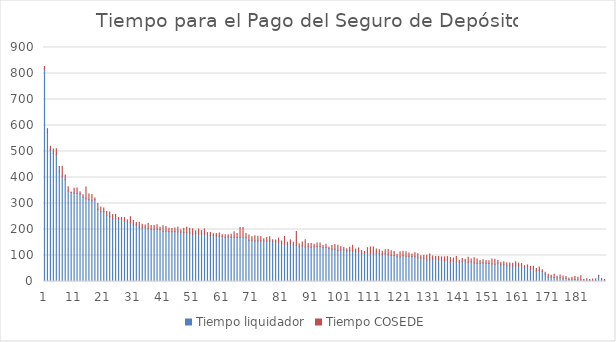
| Category | Tiempo liquidador | Tiempo COSEDE |
|---|---|---|
| 0 | 817 | 10 |
| 1 | 573 | 15 |
| 2 | 507 | 13 |
| 3 | 492 | 18 |
| 4 | 488 | 23 |
| 5 | 422 | 20 |
| 6 | 405 | 38 |
| 7 | 391 | 19 |
| 8 | 348 | 16 |
| 9 | 342 | 2 |
| 10 | 339 | 20 |
| 11 | 338 | 22 |
| 12 | 336 | 9 |
| 13 | 324 | 10 |
| 14 | 318 | 45 |
| 15 | 314 | 23 |
| 16 | 311 | 24 |
| 17 | 314 | 7 |
| 18 | 278 | 22 |
| 19 | 268 | 19 |
| 20 | 269 | 14 |
| 21 | 256 | 13 |
| 22 | 250 | 17 |
| 23 | 240 | 18 |
| 24 | 242 | 17 |
| 25 | 240 | 6 |
| 26 | 239 | 7 |
| 27 | 232 | 14 |
| 28 | 229 | 8 |
| 29 | 226 | 23 |
| 30 | 215 | 20 |
| 31 | 217 | 10 |
| 32 | 209 | 19 |
| 33 | 206 | 14 |
| 34 | 210 | 7 |
| 35 | 203 | 20 |
| 36 | 201 | 14 |
| 37 | 201 | 14 |
| 38 | 201 | 17 |
| 39 | 200 | 9 |
| 40 | 192 | 22 |
| 41 | 193 | 19 |
| 42 | 191 | 14 |
| 43 | 191 | 13 |
| 44 | 191 | 15 |
| 45 | 190 | 19 |
| 46 | 189 | 10 |
| 47 | 188 | 17 |
| 48 | 188 | 21 |
| 49 | 186 | 19 |
| 50 | 181 | 22 |
| 51 | 185 | 10 |
| 52 | 181 | 21 |
| 53 | 184 | 12 |
| 54 | 182 | 20 |
| 55 | 179 | 9 |
| 56 | 176 | 13 |
| 57 | 177 | 7 |
| 58 | 175 | 10 |
| 59 | 174 | 13 |
| 60 | 173 | 7 |
| 61 | 170 | 10 |
| 62 | 171 | 9 |
| 63 | 170 | 12 |
| 64 | 170 | 21 |
| 65 | 169 | 16 |
| 66 | 170 | 38 |
| 67 | 170 | 38 |
| 68 | 168 | 17 |
| 69 | 159 | 20 |
| 70 | 159 | 13 |
| 71 | 156 | 20 |
| 72 | 156 | 18 |
| 73 | 157 | 16 |
| 74 | 156 | 8 |
| 75 | 156 | 13 |
| 76 | 155 | 17 |
| 77 | 153 | 8 |
| 78 | 152 | 8 |
| 79 | 150 | 17 |
| 80 | 146 | 10 |
| 81 | 143 | 30 |
| 82 | 141 | 10 |
| 83 | 145 | 15 |
| 84 | 140 | 11 |
| 85 | 139 | 53 |
| 86 | 134 | 10 |
| 87 | 137 | 15 |
| 88 | 133 | 28 |
| 89 | 134 | 12 |
| 90 | 132 | 14 |
| 91 | 134 | 9 |
| 92 | 135 | 13 |
| 93 | 135 | 13 |
| 94 | 130 | 8 |
| 95 | 131 | 12 |
| 96 | 126 | 7 |
| 97 | 124 | 14 |
| 98 | 124 | 18 |
| 99 | 119 | 20 |
| 100 | 121 | 14 |
| 101 | 121 | 10 |
| 102 | 118 | 8 |
| 103 | 118 | 14 |
| 104 | 117 | 22 |
| 105 | 114 | 11 |
| 106 | 113 | 16 |
| 107 | 107 | 12 |
| 108 | 109 | 7 |
| 109 | 112 | 18 |
| 110 | 106 | 27 |
| 111 | 106 | 27 |
| 112 | 108 | 17 |
| 113 | 107 | 15 |
| 114 | 105 | 11 |
| 115 | 108 | 14 |
| 116 | 104 | 19 |
| 117 | 100 | 18 |
| 118 | 100 | 15 |
| 119 | 95 | 10 |
| 120 | 94 | 20 |
| 121 | 99 | 17 |
| 122 | 97 | 17 |
| 123 | 97 | 13 |
| 124 | 96 | 10 |
| 125 | 95 | 16 |
| 126 | 90 | 17 |
| 127 | 90 | 9 |
| 128 | 88 | 12 |
| 129 | 84 | 17 |
| 130 | 84 | 22 |
| 131 | 87 | 11 |
| 132 | 86 | 10 |
| 133 | 83 | 13 |
| 134 | 80 | 15 |
| 135 | 80 | 15 |
| 136 | 82 | 14 |
| 137 | 75 | 17 |
| 138 | 78 | 12 |
| 139 | 76 | 20 |
| 140 | 73 | 9 |
| 141 | 76 | 12 |
| 142 | 79 | 7 |
| 143 | 74 | 19 |
| 144 | 76 | 11 |
| 145 | 71 | 20 |
| 146 | 70 | 17 |
| 147 | 70 | 11 |
| 148 | 71 | 13 |
| 149 | 70 | 11 |
| 150 | 69 | 11 |
| 151 | 67 | 20 |
| 152 | 66 | 20 |
| 153 | 71 | 10 |
| 154 | 63 | 11 |
| 155 | 64 | 12 |
| 156 | 61 | 11 |
| 157 | 60 | 11 |
| 158 | 60 | 10 |
| 159 | 61 | 15 |
| 160 | 60 | 11 |
| 161 | 56 | 13 |
| 162 | 54 | 7 |
| 163 | 59 | 5 |
| 164 | 46 | 12 |
| 165 | 48 | 11 |
| 166 | 41 | 9 |
| 167 | 42 | 14 |
| 168 | 39 | 6 |
| 169 | 28 | 8 |
| 170 | 17 | 11 |
| 171 | 17 | 7 |
| 172 | 15 | 13 |
| 173 | 13 | 7 |
| 174 | 14 | 11 |
| 175 | 11 | 10 |
| 176 | 12 | 7 |
| 177 | 8 | 5 |
| 178 | 7 | 9 |
| 179 | 8 | 11 |
| 180 | 6 | 10 |
| 181 | 6 | 16 |
| 182 | 6 | 3 |
| 183 | 5 | 6 |
| 184 | 5 | 3 |
| 185 | 4 | 6 |
| 186 | 4 | 7 |
| 187 | 22 | 2 |
| 188 | 7 | 5 |
| 189 | 6 | 2 |